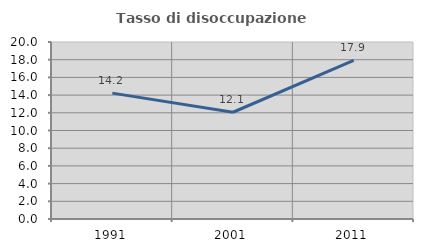
| Category | Tasso di disoccupazione giovanile  |
|---|---|
| 1991.0 | 14.223 |
| 2001.0 | 12.062 |
| 2011.0 | 17.919 |